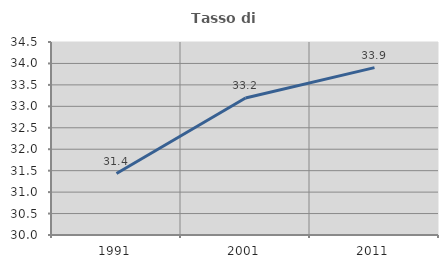
| Category | Tasso di occupazione   |
|---|---|
| 1991.0 | 31.432 |
| 2001.0 | 33.196 |
| 2011.0 | 33.903 |